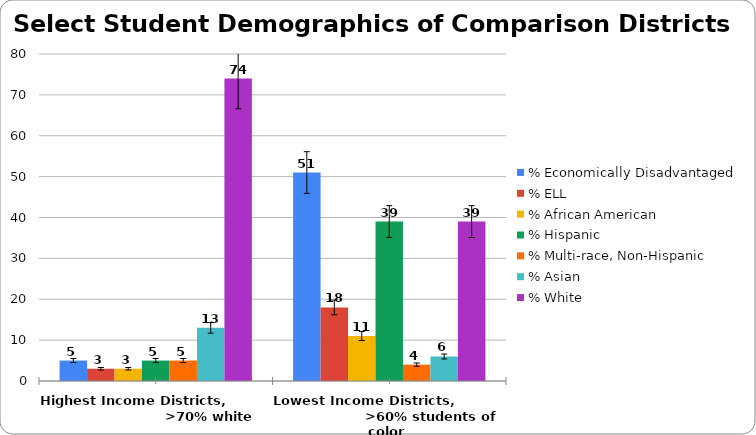
| Category | % Economically Disadvantaged | % ELL | % African American | % Hispanic | % Multi-race, Non-Hispanic | % Asian | % White |
|---|---|---|---|---|---|---|---|
| Highest Income Districts,                              >70% white | 5 | 3 | 3 | 5 | 5 | 13 | 74 |
| Lowest Income Districts,                           >60% students of color  | 51 | 18 | 11 | 39 | 4 | 6 | 39 |